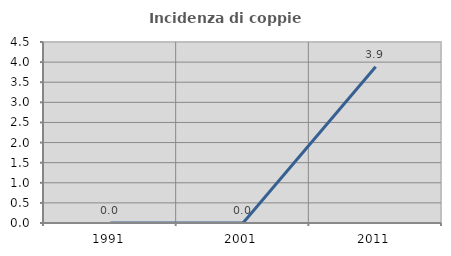
| Category | Incidenza di coppie miste |
|---|---|
| 1991.0 | 0 |
| 2001.0 | 0 |
| 2011.0 | 3.883 |